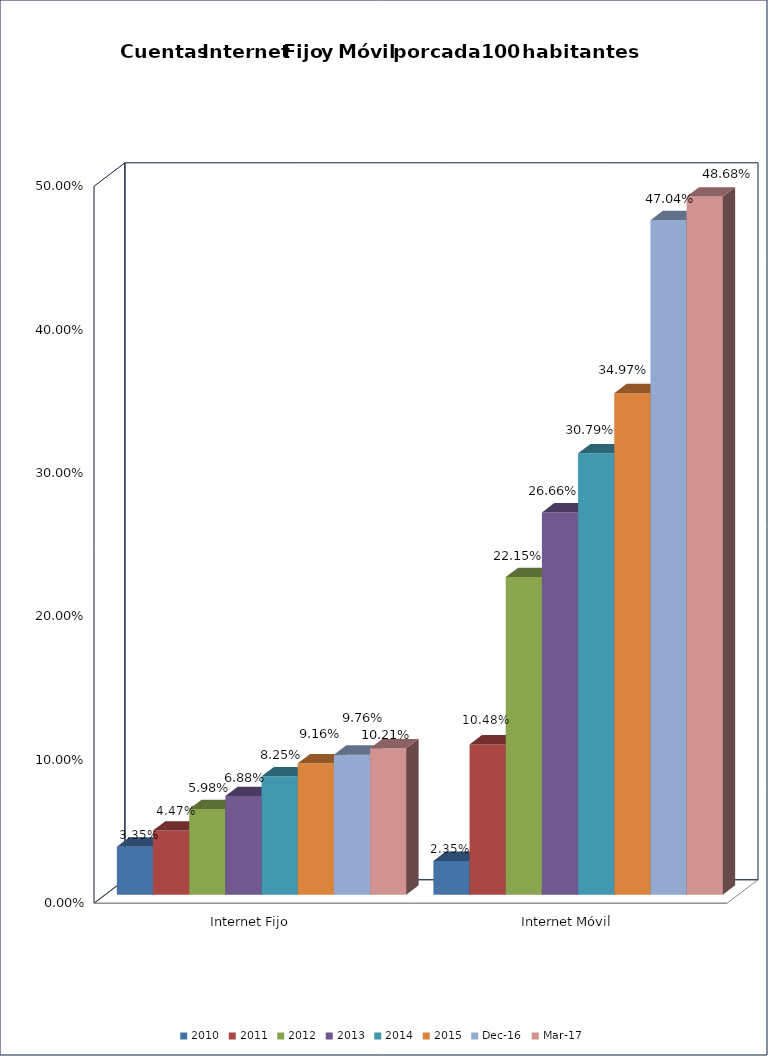
| Category | 2010 | 2011 | 2012 | 2013 | 2014 | 2015 | dic-16 | mar-17 |
|---|---|---|---|---|---|---|---|---|
| Internet Fijo | 0.033 | 0.045 | 0.06 | 0.069 | 0.083 | 0.092 | 0.098 | 0.102 |
| Internet Móvil | 0.024 | 0.105 | 0.222 | 0.267 | 0.308 | 0.35 | 0.47 | 0.487 |